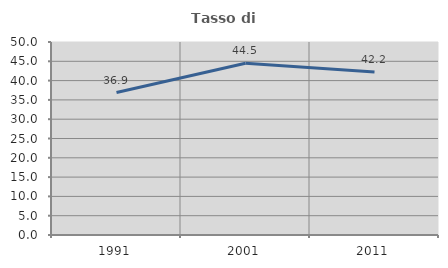
| Category | Tasso di occupazione   |
|---|---|
| 1991.0 | 36.902 |
| 2001.0 | 44.515 |
| 2011.0 | 42.208 |